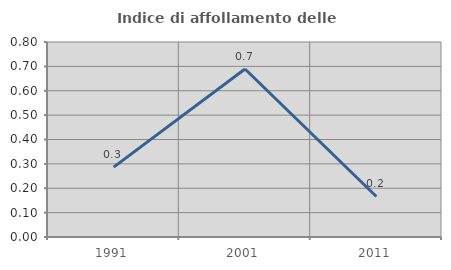
| Category | Indice di affollamento delle abitazioni  |
|---|---|
| 1991.0 | 0.287 |
| 2001.0 | 0.689 |
| 2011.0 | 0.166 |